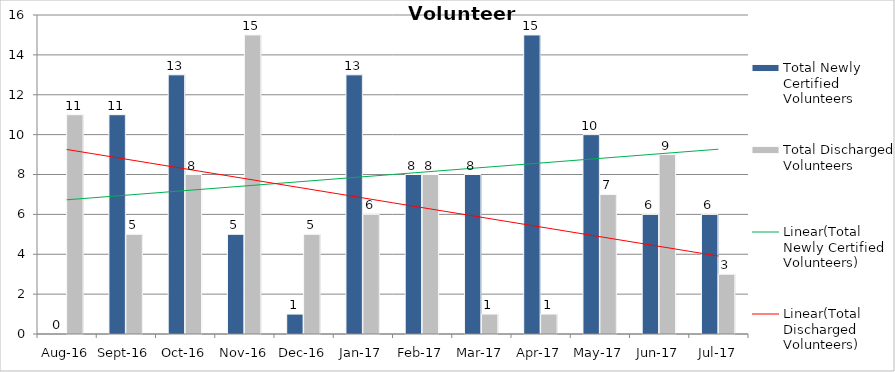
| Category | Total Newly Certified Volunteers | Total Discharged Volunteers |
|---|---|---|
| Aug-16 | 0 | 11 |
| Sep-16 | 11 | 5 |
| Oct-16 | 13 | 8 |
| Nov-16 | 5 | 15 |
| Dec-16 | 1 | 5 |
| Jan-17 | 13 | 6 |
| Feb-17 | 8 | 8 |
| Mar-17 | 8 | 1 |
| Apr-17 | 15 | 1 |
| May-17 | 10 | 7 |
| Jun-17 | 6 | 9 |
| Jul-17 | 6 | 3 |